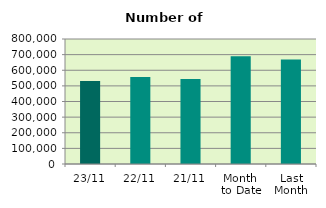
| Category | Series 0 |
|---|---|
| 23/11 | 531014 |
| 22/11 | 556944 |
| 21/11 | 543632 |
| Month 
to Date | 688986.941 |
| Last
Month | 669366.857 |